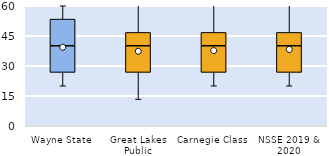
| Category | 25th | 50th | 75th |
|---|---|---|---|
| Wayne State | 26.667 | 13.333 | 13.333 |
| Great Lakes Public | 26.667 | 13.333 | 6.667 |
| Carnegie Class | 26.667 | 13.333 | 6.667 |
| NSSE 2019 & 2020 | 26.667 | 13.333 | 6.667 |